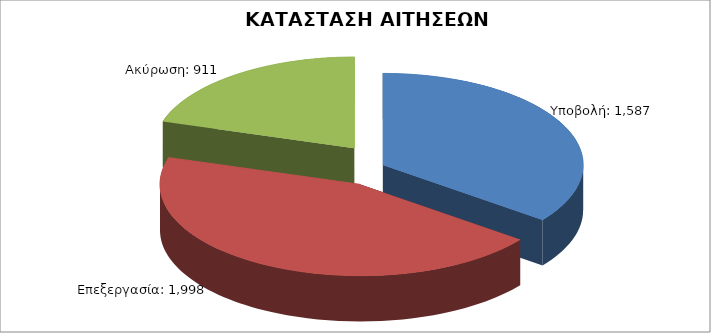
| Category | Series 0 |
|---|---|
| Υποβολή: | 1587 |
| Επεξεργασία: | 1998 |
| Ακύρωση: | 911 |